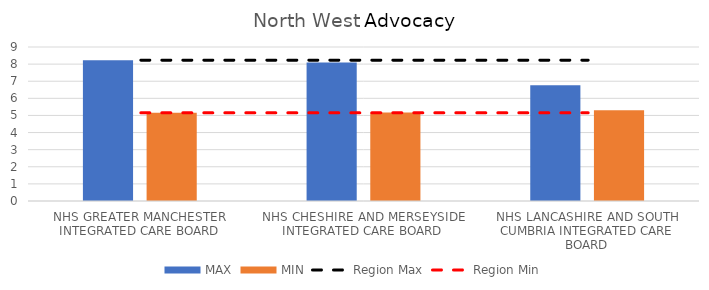
| Category | MAX | MIN |
|---|---|---|
| NHS GREATER MANCHESTER INTEGRATED CARE BOARD | 8.23 | 5.154 |
| NHS CHESHIRE AND MERSEYSIDE INTEGRATED CARE BOARD | 8.095 | 5.169 |
| NHS LANCASHIRE AND SOUTH CUMBRIA INTEGRATED CARE BOARD | 6.764 | 5.301 |